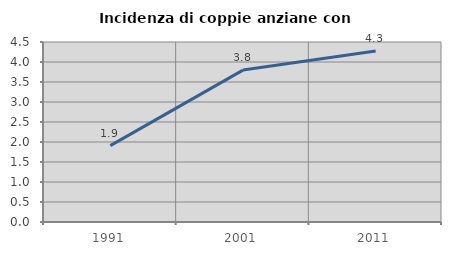
| Category | Incidenza di coppie anziane con figli |
|---|---|
| 1991.0 | 1.908 |
| 2001.0 | 3.798 |
| 2011.0 | 4.273 |